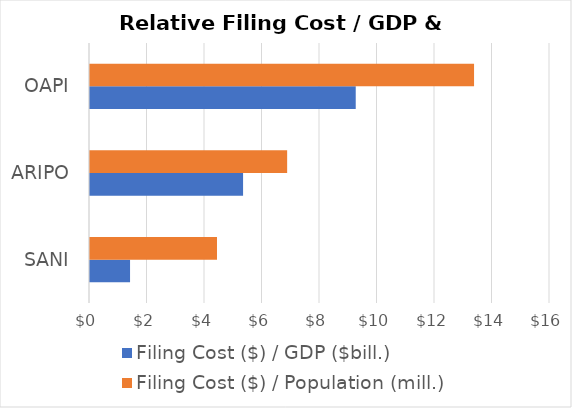
| Category | Filing Cost ($) / GDP ($bill.) | Filing Cost ($) / Population (mill.) |
|---|---|---|
| SANI | 1.393 | 4.417 |
| ARIPO | 5.324 | 6.857 |
| OAPI | 9.243 | 13.358 |